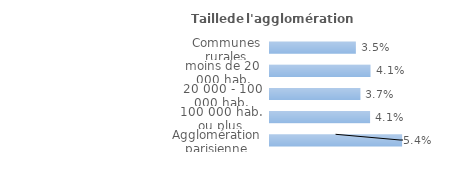
| Category | Series 0 |
|---|---|
| Communes rurales | 0.035 |
| moins de 20 000 hab. | 0.041 |
| 20 000 - 100 000 hab. | 0.037 |
| 100 000 hab. ou plus | 0.041 |
| Agglomération parisienne | 0.054 |